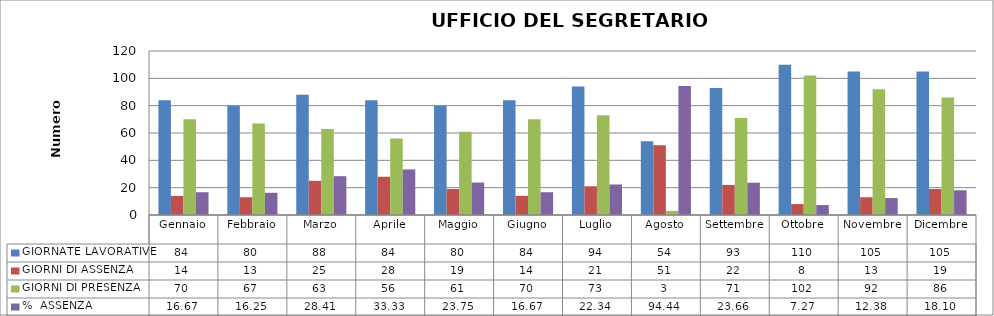
| Category | GIORNATE LAVORATIVE | GIORNI DI ASSENZA | GIORNI DI PRESENZA | %  ASSENZA |
|---|---|---|---|---|
| Gennaio | 84 | 14 | 70 | 16.667 |
| Febbraio | 80 | 13 | 67 | 16.25 |
| Marzo | 88 | 25 | 63 | 28.409 |
| Aprile | 84 | 28 | 56 | 33.333 |
| Maggio | 80 | 19 | 61 | 23.75 |
| Giugno | 84 | 14 | 70 | 16.667 |
| Luglio | 94 | 21 | 73 | 22.34 |
| Agosto | 54 | 51 | 3 | 94.444 |
| Settembre | 93 | 22 | 71 | 23.656 |
| Ottobre | 110 | 8 | 102 | 7.273 |
| Novembre | 105 | 13 | 92 | 12.381 |
| Dicembre | 105 | 19 | 86 | 18.095 |